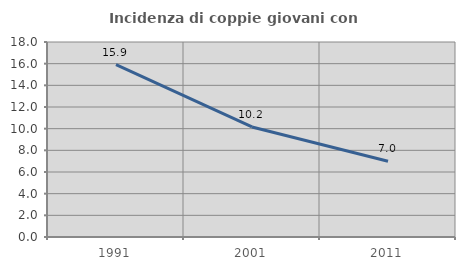
| Category | Incidenza di coppie giovani con figli |
|---|---|
| 1991.0 | 15.914 |
| 2001.0 | 10.156 |
| 2011.0 | 6.992 |